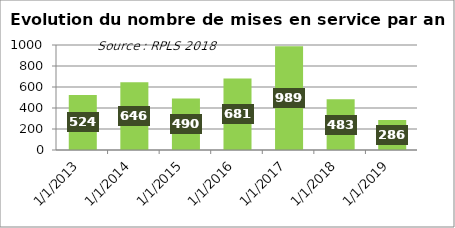
| Category | Series 0 |
|---|---|
| 2013-01-01 | 524 |
| 2014-01-01 | 646 |
| 2015-01-01 | 490 |
| 2016-01-01 | 681 |
| 2017-01-01 | 989 |
| 2018-01-01 | 483 |
| 2019-01-01 | 286 |